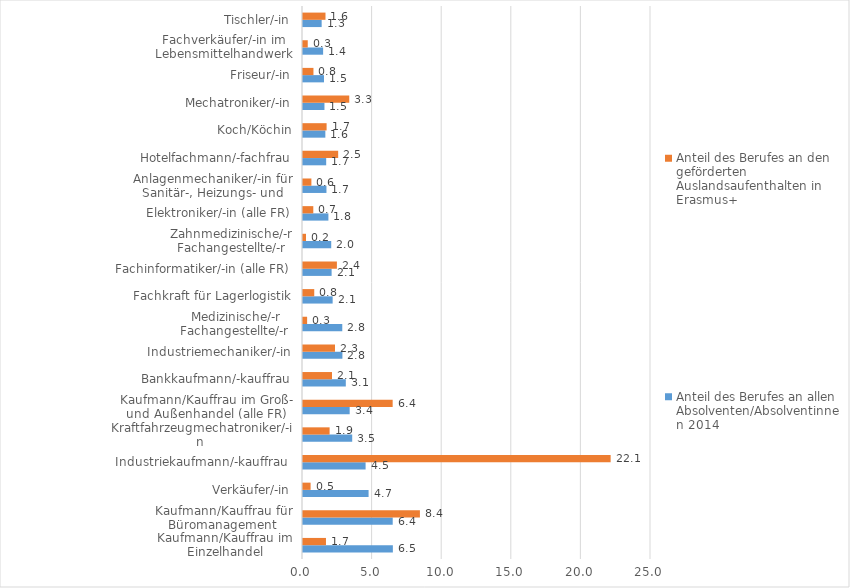
| Category | Anteil des Berufes an allen Absolventen/Absolventinnen 2014 | Anteil des Berufes an den geförderten Auslandsaufenthalten in Erasmus+ |
|---|---|---|
| Kaufmann/Kauffrau im Einzelhandel | 6.456 | 1.65 |
| Kaufmann/Kauffrau für Büromanagement  | 6.445 | 8.399 |
| Verkäufer/-in | 4.711 | 0.546 |
| Industriekaufmann/-kauffrau  | 4.497 | 22.101 |
| Kraftfahrzeugmechatroniker/-in  | 3.535 | 1.912 |
| Kaufmann/Kauffrau im Groß- und Außenhandel (alle FR) | 3.353 | 6.441 |
| Bankkaufmann/-kauffrau | 3.076 | 2.083 |
| Industriemechaniker/-in | 2.831 | 2.299 |
| Medizinische/-r Fachangestellte/-r  | 2.822 | 0.296 |
| Fachkraft für Lagerlogistik | 2.13 | 0.808 |
| Fachinformatiker/-in (alle FR) | 2.055 | 2.435 |
| Zahnmedizinische/-r Fachangestellte/-r | 2.027 | 0.216 |
| Elektroniker/-in (alle FR) | 1.825 | 0.74 |
| Anlagenmechaniker/-in für Sanitär-, Heizungs- und Klimatechnik | 1.685 | 0.603 |
| Hotelfachmann/-fachfrau | 1.666 | 2.526 |
| Koch/Köchin | 1.605 | 1.696 |
| Mechatroniker/-in | 1.542 | 3.323 |
| Friseur/-in | 1.511 | 0.751 |
| Fachverkäufer/-in im Lebensmittelhandwerk | 1.445 | 0.341 |
| Tischler/-in | 1.341 | 1.616 |